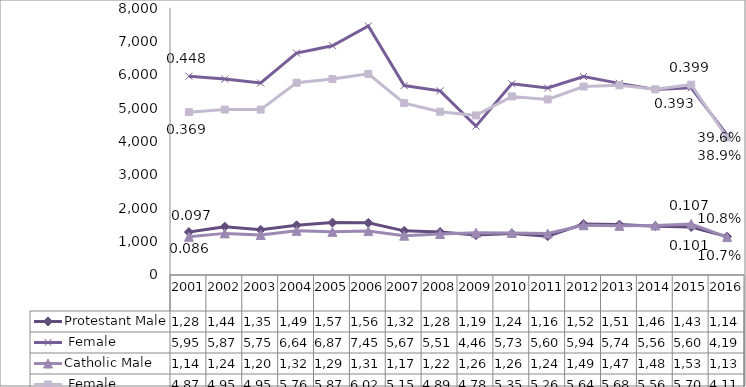
| Category | Protestant | Catholic |
|---|---|---|
| 2001.0 | 5955 | 4879 |
| 2002.0 | 5870 | 4957 |
| 2003.0 | 5752 | 4956 |
| 2004.0 | 6648 | 5761 |
| 2005.0 | 6870 | 5871 |
| 2006.0 | 7459 | 6026 |
| 2007.0 | 5678 | 5151 |
| 2008.0 | 5517 | 4893 |
| 2009.0 | 4461 | 4782 |
| 2010.0 | 5730 | 5351 |
| 2011.0 | 5602 | 5261 |
| 2012.0 | 5946 | 5647 |
| 2013.0 | 5742 | 5682 |
| 2014.0 | 5560 | 5563 |
| 2015.0 | 5609 | 5703 |
| 2016.0 | 4196 | 4119 |